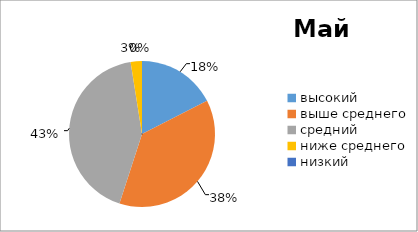
| Category | Series 0 |
|---|---|
| высокий  | 7 |
| выше среднего | 15 |
| средний | 17 |
| ниже среднего | 1 |
| низкий | 0 |